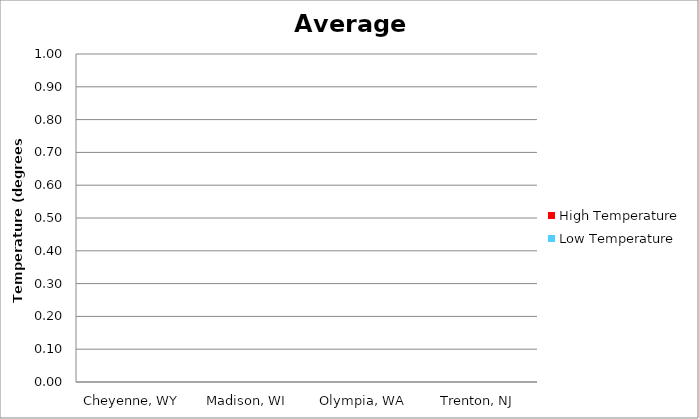
| Category | High Temperature | Low Temperature |
|---|---|---|
| Cheyenne, WY | 0 | 0 |
| Madison, WI | 0 | 0 |
| Olympia, WA | 0 | 0 |
| Trenton, NJ | 0 | 0 |